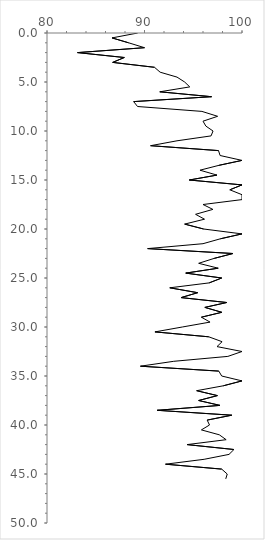
| Category | Series 0 |
|---|---|
| 89.3048128342246 | 0 |
| 86.66666666666667 | 0.5 |
| 88.37209302325581 | 1 |
| 90.0 | 1.5 |
| 83.13253012048193 | 2 |
| 87.93103448275862 | 2.5 |
| 86.73469387755102 | 3 |
| 91.02564102564102 | 3.5 |
| 91.6030534351145 | 4 |
| 93.33333333333333 | 4.5 |
| 94.11764705882352 | 5 |
| 94.64285714285714 | 5.5 |
| 91.56626506024097 | 6 |
| 96.875 | 6.5 |
| 88.88888888888889 | 7 |
| 89.28571428571429 | 7.5 |
| 95.8904109589041 | 8 |
| 97.5 | 8.5 |
| 96.0 | 9 |
| 96.29629629629629 | 9.5 |
| 97.02970297029702 | 10 |
| 96.82539682539682 | 10.5 |
| 93.33333333333333 | 11 |
| 90.625 | 11.5 |
| 97.59036144578313 | 12 |
| 97.75280898876404 | 12.5 |
| 100.0 | 13 |
| 97.6470588235294 | 13.5 |
| 95.6896551724138 | 14 |
| 97.43589743589743 | 14.5 |
| 94.5945945945946 | 15 |
| 100.0 | 15.5 |
| 98.75 | 16 |
| 100.0 | 16.5 |
| 100.0 | 17 |
| 96.0 | 17.5 |
| 97.01492537313433 | 18 |
| 95.23809523809523 | 18.5 |
| 96.15384615384616 | 19 |
| 94.11764705882352 | 19.5 |
| 96.06299212598425 | 20 |
| 100.0 | 20.5 |
| 97.77777777777777 | 21 |
| 96.0 | 21.5 |
| 90.32258064516128 | 22 |
| 99.07407407407408 | 22.5 |
| 97.14285714285714 | 23 |
| 95.55555555555556 | 23.5 |
| 97.5609756097561 | 24 |
| 94.23076923076923 | 24.5 |
| 97.91666666666666 | 25 |
| 96.62921348314607 | 25.5 |
| 92.5925925925926 | 26 |
| 95.45454545454545 | 26.5 |
| 93.75 | 27 |
| 98.4375 | 27.5 |
| 96.19047619047619 | 28 |
| 97.93103448275862 | 28.5 |
| 95.83333333333334 | 29 |
| 96.72131147540983 | 29.5 |
| 93.87755102040816 | 30 |
| 91.07142857142857 | 30.5 |
| 96.5909090909091 | 31 |
| 97.95918367346938 | 31.5 |
| 97.43589743589743 | 32 |
| 100.0 | 32.5 |
| 98.55072463768117 | 33 |
| 93.0 | 33.5 |
| 89.58333333333334 | 34 |
| 97.61904761904762 | 34.5 |
| 97.91666666666666 | 35 |
| 100.0 | 35.5 |
| 98.07692307692307 | 36 |
| 95.34883720930233 | 36.5 |
| 97.47899159663865 | 37 |
| 95.55555555555556 | 37.5 |
| 97.74436090225564 | 38 |
| 91.30434782608695 | 38.5 |
| 98.94736842105263 | 39 |
| 96.42857142857143 | 39.5 |
| 96.66666666666667 | 40 |
| 95.83333333333334 | 40.5 |
| 97.67441860465115 | 41 |
| 98.3739837398374 | 41.5 |
| 94.36619718309859 | 42 |
| 99.17355371900827 | 42.5 |
| 98.66666666666667 | 43 |
| 96.11650485436894 | 43.5 |
| 92.15686274509804 | 44 |
| 97.91666666666666 | 44.5 |
| 98.48484848484848 | 45 |
| 98.33333333333333 | 45.5 |